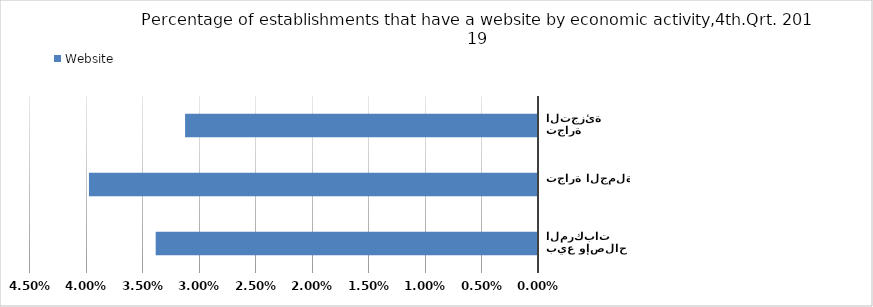
| Category | Website |
|---|---|
| بيع وإصلاح المركبات  | 0.034 |
| تجارة الجملة | 0.04 |
| تجارة التجزئة | 0.031 |